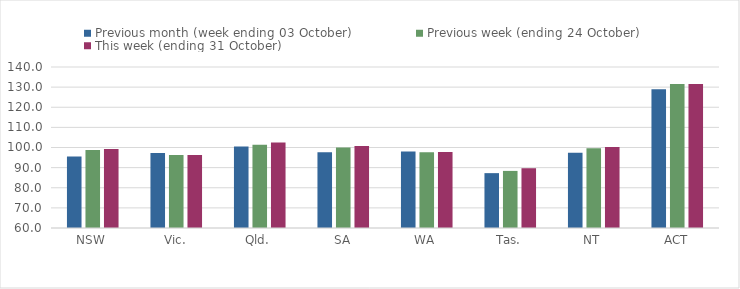
| Category | Previous month (week ending 03 October) | Previous week (ending 24 October) | This week (ending 31 October) |
|---|---|---|---|
| NSW | 95.5 | 98.81 | 99.25 |
| Vic. | 97.24 | 96.26 | 96.3 |
| Qld. | 100.47 | 101.4 | 102.51 |
| SA | 97.7 | 100.06 | 100.69 |
| WA | 98.01 | 97.63 | 97.72 |
| Tas. | 87.26 | 88.37 | 89.7 |
| NT | 97.4 | 99.57 | 100.23 |
| ACT | 128.95 | 131.58 | 131.53 |